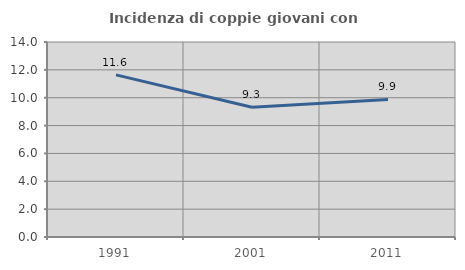
| Category | Incidenza di coppie giovani con figli |
|---|---|
| 1991.0 | 11.642 |
| 2001.0 | 9.317 |
| 2011.0 | 9.877 |